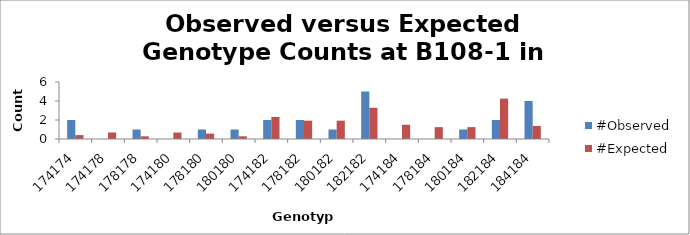
| Category | #Observed | #Expected |
|---|---|---|
| 174174.0 | 2 | 0.409 |
| 174178.0 | 0 | 0.682 |
| 178178.0 | 1 | 0.284 |
| 174180.0 | 0 | 0.682 |
| 178180.0 | 1 | 0.568 |
| 180180.0 | 1 | 0.284 |
| 174182.0 | 2 | 2.318 |
| 178182.0 | 2 | 1.932 |
| 180182.0 | 1 | 1.932 |
| 182182.0 | 5 | 3.284 |
| 174184.0 | 0 | 1.5 |
| 178184.0 | 0 | 1.25 |
| 180184.0 | 1 | 1.25 |
| 182184.0 | 2 | 4.25 |
| 184184.0 | 4 | 1.375 |